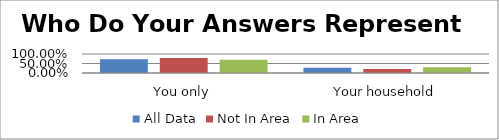
| Category | All Data | Not In Area | In Area |
|---|---|---|---|
| You only | 0.729 | 0.789 | 0.7 |
| Your household | 0.271 | 0.211 | 0.3 |